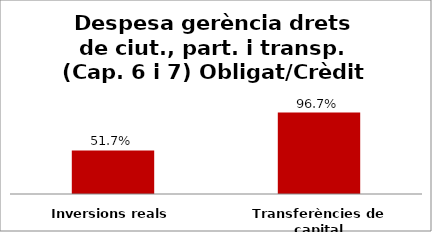
| Category | Series 0 |
|---|---|
| Inversions reals | 0.517 |
| Transferències de capital | 0.967 |